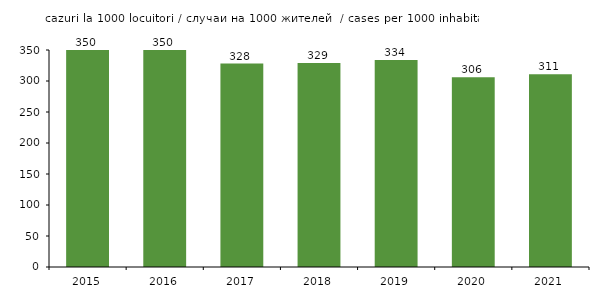
| Category | La 1000 locuitori - total 
На 1000 жителей - всего 
Per 1000 inhabitants - total |
|---|---|
| 2015.0 | 349.81 |
| 2016.0 | 349.81 |
| 2017.0 | 328.161 |
| 2018.0 | 329.106 |
| 2019.0 | 334.035 |
| 2020.0 | 306 |
| 2021.0 | 311 |